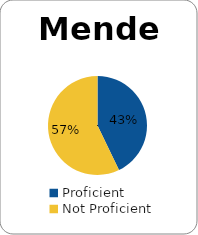
| Category | Series 0 |
|---|---|
| Proficient | 0.429 |
| Not Proficient | 0.571 |